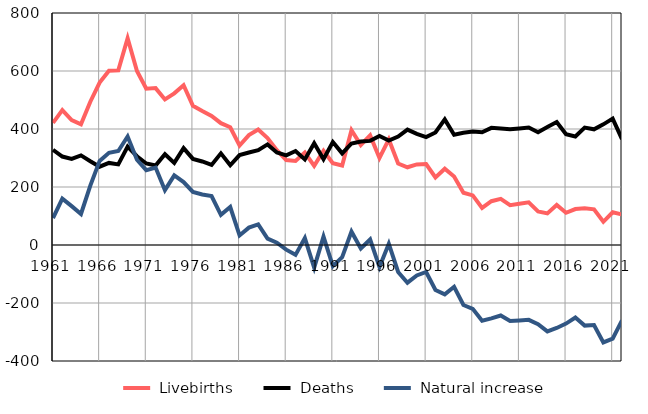
| Category |  Livebirths |  Deaths |  Natural increase |
|---|---|---|---|
| 1961.0 | 421 | 328 | 93 |
| 1962.0 | 465 | 305 | 160 |
| 1963.0 | 431 | 297 | 134 |
| 1964.0 | 416 | 309 | 107 |
| 1965.0 | 494 | 289 | 205 |
| 1966.0 | 560 | 270 | 290 |
| 1967.0 | 601 | 283 | 318 |
| 1968.0 | 602 | 278 | 324 |
| 1969.0 | 713 | 339 | 374 |
| 1970.0 | 600 | 306 | 294 |
| 1971.0 | 539 | 281 | 258 |
| 1972.0 | 541 | 274 | 267 |
| 1973.0 | 502 | 313 | 189 |
| 1974.0 | 523 | 283 | 240 |
| 1975.0 | 551 | 334 | 217 |
| 1976.0 | 480 | 297 | 183 |
| 1977.0 | 462 | 288 | 174 |
| 1978.0 | 445 | 276 | 169 |
| 1979.0 | 420 | 316 | 104 |
| 1980.0 | 406 | 275 | 131 |
| 1981.0 | 343 | 310 | 33 |
| 1982.0 | 379 | 319 | 60 |
| 1983.0 | 398 | 327 | 71 |
| 1984.0 | 369 | 347 | 22 |
| 1985.0 | 327 | 319 | 8 |
| 1986.0 | 293 | 309 | -16 |
| 1987.0 | 290 | 324 | -34 |
| 1988.0 | 319 | 295 | 24 |
| 1989.0 | 273 | 351 | -78 |
| 1990.0 | 325 | 296 | 29 |
| 1991.0 | 282 | 355 | -73 |
| 1992.0 | 274 | 316 | -42 |
| 1993.0 | 396 | 350 | 46 |
| 1994.0 | 345 | 357 | -12 |
| 1995.0 | 378 | 359 | 19 |
| 1996.0 | 300 | 376 | -76 |
| 1997.0 | 364 | 360 | 4 |
| 1998.0 | 281 | 374 | -93 |
| 1999.0 | 268 | 398 | -130 |
| 2000.0 | 278 | 383 | -105 |
| 2001.0 | 279 | 372 | -93 |
| 2002.0 | 233 | 388 | -155 |
| 2003.0 | 263 | 433 | -170 |
| 2004.0 | 236 | 380 | -144 |
| 2005.0 | 180 | 387 | -207 |
| 2006.0 | 171 | 391 | -220 |
| 2007.0 | 128 | 389 | -261 |
| 2008.0 | 151 | 404 | -253 |
| 2009.0 | 159 | 402 | -243 |
| 2010.0 | 137 | 399 | -262 |
| 2011.0 | 142 | 402 | -260 |
| 2012.0 | 147 | 405 | -258 |
| 2013.0 | 116 | 389 | -273 |
| 2014.0 | 109 | 407 | -298 |
| 2015.0 | 138 | 424 | -286 |
| 2016.0 | 111 | 382 | -271 |
| 2017.0 | 124 | 374 | -250 |
| 2018.0 | 127 | 405 | -278 |
| 2019.0 | 123 | 399 | -276 |
| 2020.0 | 80 | 416 | -336 |
| 2021.0 | 113 | 436 | -323 |
| 2022.0 | 105 | 365 | -260 |